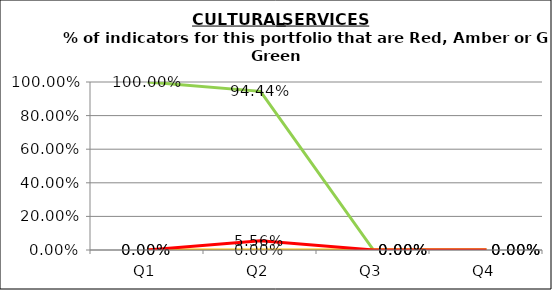
| Category | Green | Amber | Red |
|---|---|---|---|
| Q1 | 1 | 0 | 0 |
| Q2 | 0.944 | 0 | 0.056 |
| Q3 | 0 | 0 | 0 |
| Q4 | 0 | 0 | 0 |